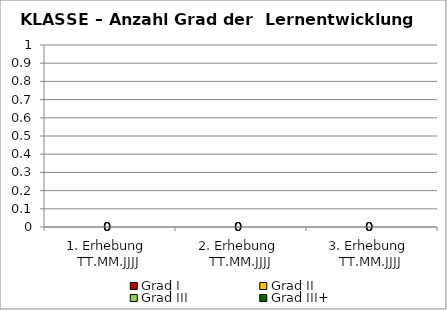
| Category | Grad I | Grad II | Grad III | Grad III+ |
|---|---|---|---|---|
| 1. Erhebung 
TT.MM.JJJJ | 0 | 0 | 0 | 0 |
| 2. Erhebung 
TT.MM.JJJJ | 0 | 0 | 0 | 0 |
| 3. Erhebung 
TT.MM.JJJJ | 0 | 0 | 0 | 0 |